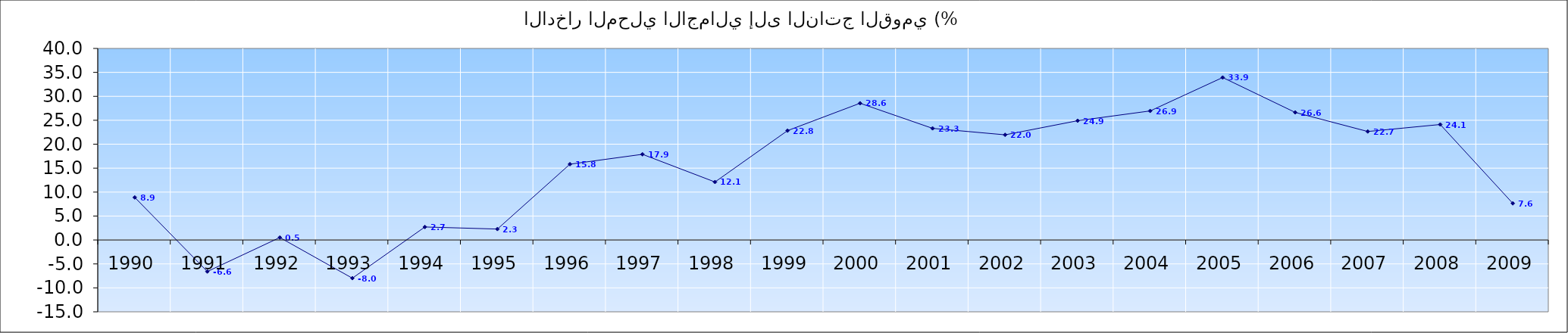
| Category | الادخار المحلي الاجمالي إلى الناتج القومي (%) |
|---|---|
| 1990.0 | 8.888 |
| 1991.0 | -6.585 |
| 1992.0 | 0.514 |
| 1993.0 | -7.977 |
| 1994.0 | 2.716 |
| 1995.0 | 2.283 |
| 1996.0 | 15.831 |
| 1997.0 | 17.892 |
| 1998.0 | 12.109 |
| 1999.0 | 22.833 |
| 2000.0 | 28.555 |
| 2001.0 | 23.309 |
| 2002.0 | 21.959 |
| 2003.0 | 24.907 |
| 2004.0 | 26.949 |
| 2005.0 | 33.929 |
| 2006.0 | 26.642 |
| 2007.0 | 22.656 |
| 2008.0 | 24.115 |
| 2009.0 | 7.649 |